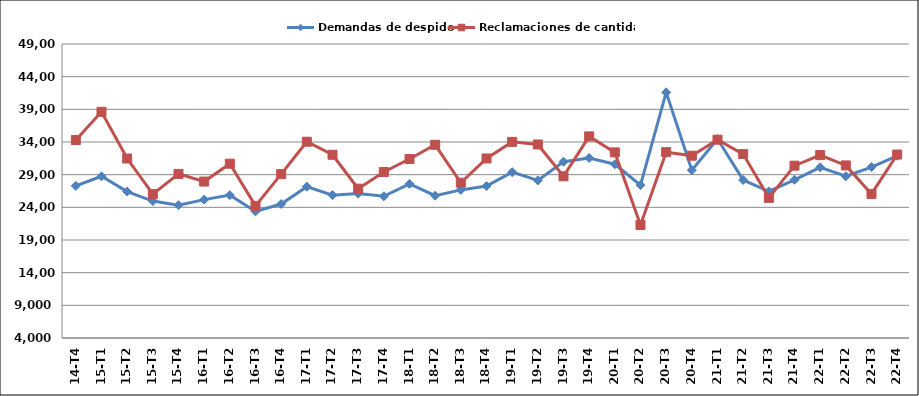
| Category | Demandas de despido | Reclamaciones de cantidad |
|---|---|---|
| 14-T4 | 27278 | 34299 |
| 15-T1 | 28755 | 38621 |
| 15-T2 | 26417 | 31470 |
| 15-T3 | 24957 | 26018 |
| 15-T4 | 24328 | 29112 |
| 16-T1 | 25182 | 27945 |
| 16-T2 | 25866 | 30682 |
| 16-T3 | 23364 | 24220 |
| 16-T4 | 24509 | 29081 |
| 17-T1 | 27166 | 34041 |
| 17-T2 | 25869 | 32047 |
| 17-T3 | 26101 | 26854 |
| 17-T4 | 25688 | 29408 |
| 18-T1 | 27589 | 31392 |
| 18-T2 | 25785 | 33573 |
| 18-T3 | 26669 | 27761 |
| 18-T4 | 27251 | 31480 |
| 19-T1 | 29386 | 34020 |
| 19-T2 | 28121 | 33623 |
| 19-T3 | 30981 | 28752 |
| 19-T4 | 31561 | 34857 |
| 20-T1 | 30597 | 32408 |
| 20-T2 | 27401 | 21297 |
| 20-T3 | 41597 | 32446 |
| 20-T4 | 29692 | 31906 |
| 21-T1 | 34461 | 34356 |
| 21-T2 | 28179 | 32151 |
| 21-T3 | 26434 | 25447 |
| 21-T4 | 28219 | 30377 |
| 22-T1 | 30126 | 31990 |
| 22-T2 | 28753 | 30414 |
| 22-T3 | 30167 | 26050 |
| 22-T4 | 31889 | 32084 |